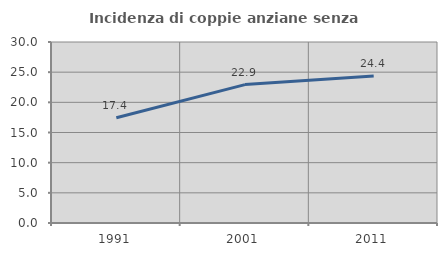
| Category | Incidenza di coppie anziane senza figli  |
|---|---|
| 1991.0 | 17.439 |
| 2001.0 | 22.939 |
| 2011.0 | 24.378 |